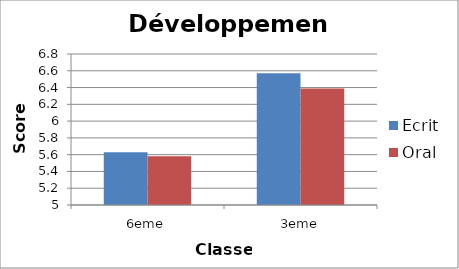
| Category | Ecrit | Oral |
|---|---|---|
| 6eme | 5.63 | 5.58 |
| 3eme | 6.57 | 6.39 |